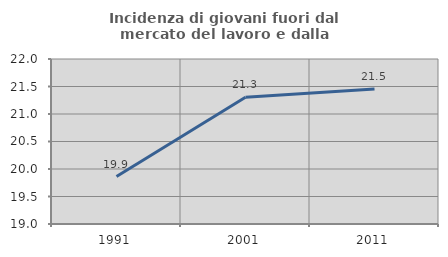
| Category | Incidenza di giovani fuori dal mercato del lavoro e dalla formazione  |
|---|---|
| 1991.0 | 19.862 |
| 2001.0 | 21.303 |
| 2011.0 | 21.455 |